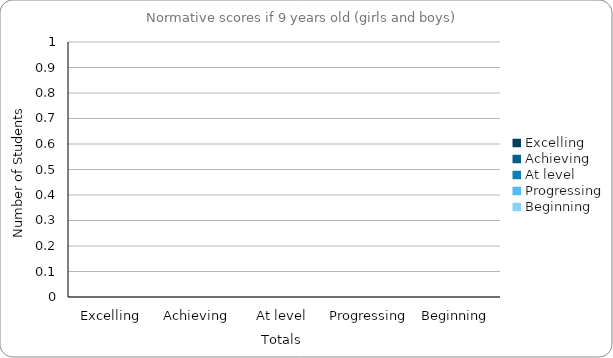
| Category | If 9 Years Old |
|---|---|
| Excelling | 0 |
| Achieving | 0 |
| At level | 0 |
| Progressing | 0 |
| Beginning | 0 |